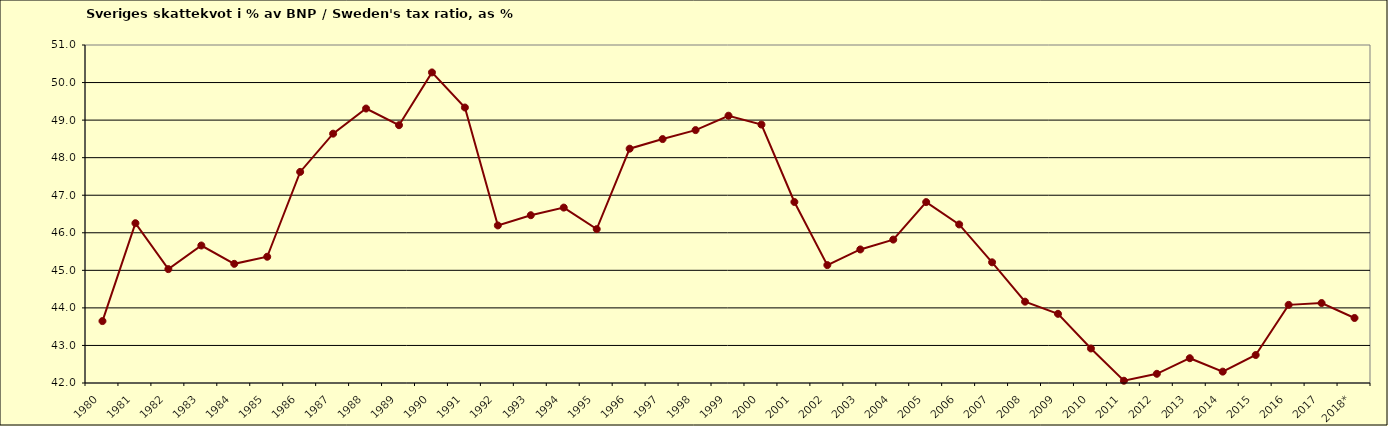
| Category | Series 0 |
|---|---|
| 1980 | 43.649 |
| 1981 | 46.255 |
| 1982 | 45.032 |
| 1983 | 45.661 |
| 1984 | 45.173 |
| 1985 | 45.362 |
| 1986 | 47.621 |
| 1987 | 48.639 |
| 1988 | 49.308 |
| 1989 | 48.865 |
| 1990 | 50.269 |
| 1991 | 49.336 |
| 1992 | 46.195 |
| 1993 | 46.468 |
| 1994 | 46.671 |
| 1995 | 46.097 |
| 1996 | 48.239 |
| 1997 | 48.495 |
| 1998 | 48.734 |
| 1999 | 49.117 |
| 2000 | 48.881 |
| 2001 | 46.82 |
| 2002 | 45.14 |
| 2003 | 45.556 |
| 2004 | 45.818 |
| 2005 | 46.817 |
| 2006 | 46.222 |
| 2007 | 45.213 |
| 2008 | 44.166 |
| 2009 | 43.842 |
| 2010 | 42.919 |
| 2011 | 42.061 |
| 2012 | 42.245 |
| 2013 | 42.66 |
| 2014 | 42.303 |
| 2015 | 42.745 |
| 2016 | 44.08 |
| 2017 | 44.129 |
| 2018* | 43.731 |